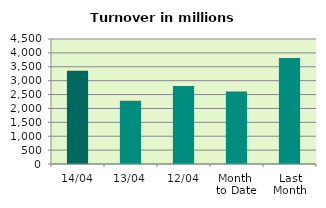
| Category | Series 0 |
|---|---|
| 14/04 | 3359.418 |
| 13/04 | 2276.214 |
| 12/04 | 2805.414 |
| Month 
to Date | 2613.563 |
| Last
Month | 3816.191 |